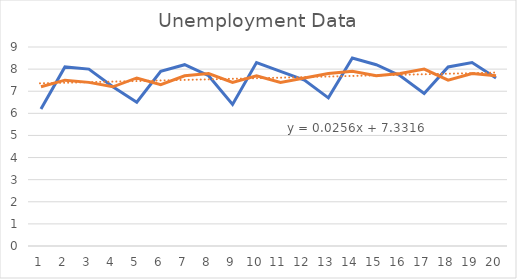
| Category | Series 0 | Series 1 |
|---|---|---|
| 0 | 6.2 | 7.2 |
| 1 | 8.1 | 7.5 |
| 2 | 8 | 7.4 |
| 3 | 7.2 | 7.2 |
| 4 | 6.5 | 7.6 |
| 5 | 7.9 | 7.3 |
| 6 | 8.2 | 7.7 |
| 7 | 7.7 | 7.8 |
| 8 | 6.4 | 7.4 |
| 9 | 8.3 | 7.7 |
| 10 | 7.9 | 7.4 |
| 11 | 7.5 | 7.6 |
| 12 | 6.7 | 7.8 |
| 13 | 8.5 | 7.9 |
| 14 | 8.2 | 7.7 |
| 15 | 7.7 | 7.8 |
| 16 | 6.9 | 8 |
| 17 | 8.1 | 7.5 |
| 18 | 8.3 | 7.8 |
| 19 | 7.6 | 7.7 |